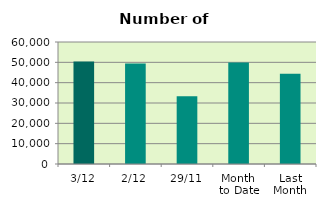
| Category | Series 0 |
|---|---|
| 3/12 | 50374 |
| 2/12 | 49476 |
| 29/11 | 33308 |
| Month 
to Date | 49925 |
| Last
Month | 44331.238 |